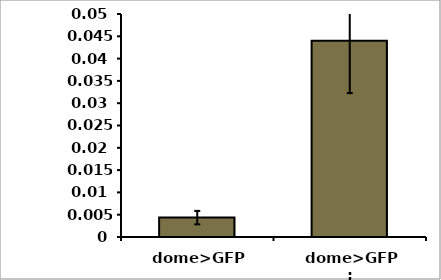
| Category | Series 0 |
|---|---|
| dome>GFP | 0.004 |
| dome>GFP; whd1/whd1 | 0.044 |